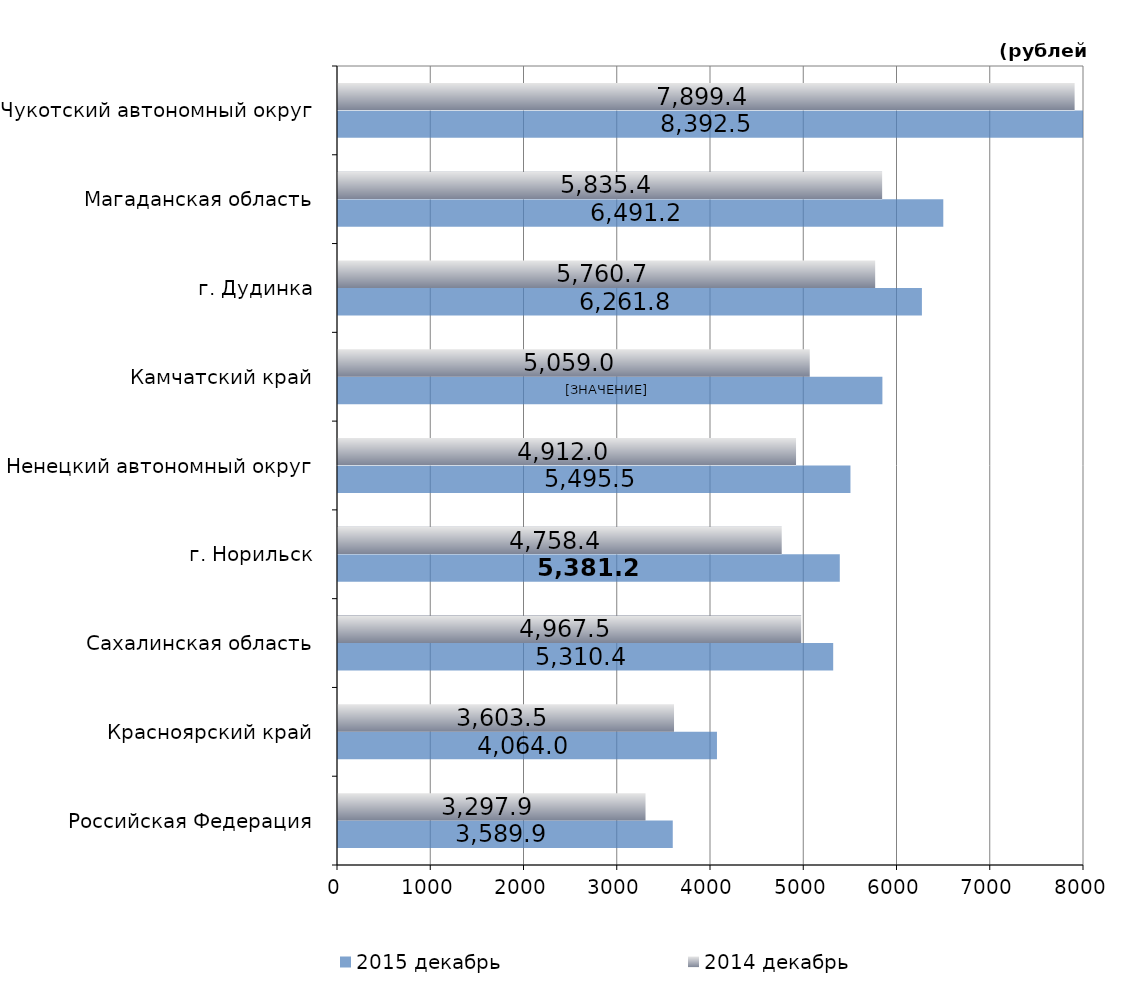
| Category | 2015 декабрь | 2014 декабрь |
|---|---|---|
| Российская Федерация | 3589.92 | 3297.89 |
| Красноярский край | 4063.97 | 3603.54 |
| Сахалинская область | 5310.43 | 4967.52 |
| г. Норильск | 5381.16 | 4758.39 |
| Ненецкий автономный округ | 5495.5 | 4912.03 |
| Камчатский край | 5838.08 | 5059.03 |
| г. Дудинка | 6261.8 | 5760.67 |
| Магаданская область | 6491.18 | 5835.36 |
| Чукотский автономный округ | 8392.52 | 7899.38 |